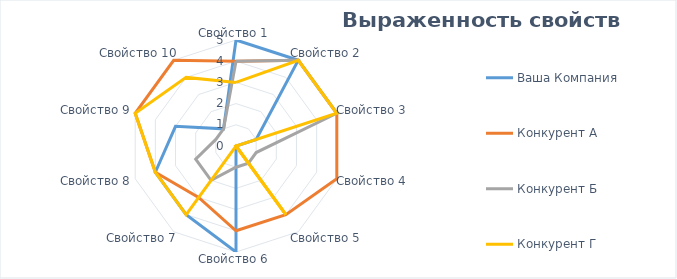
| Category | Ваша Компания | Конкурент А | Конкурент Б | Конкурент Г |
|---|---|---|---|---|
| Свойство 1 | 5 | 4 | 4 | 3 |
| Свойство 2 | 5 | 5 | 5 | 5 |
| Свойство 3 | 1 | 5 | 5 | 5 |
| Свойство 4 | 0 | 5 | 1 | 0 |
| Свойство 5 | 0 | 4 | 1 | 4 |
| Свойство 6 | 5 | 4 | 1 | 0 |
| Свойство 7 | 4 | 3 | 2 | 4 |
| Свойство 8 | 4 | 4 | 2 | 4 |
| Свойство 9 | 3 | 5 | 1 | 5 |
| Свойство 10 | 1 | 5 | 1 | 4 |